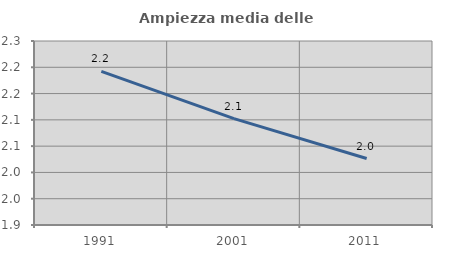
| Category | Ampiezza media delle famiglie |
|---|---|
| 1991.0 | 2.192 |
| 2001.0 | 2.102 |
| 2011.0 | 2.026 |